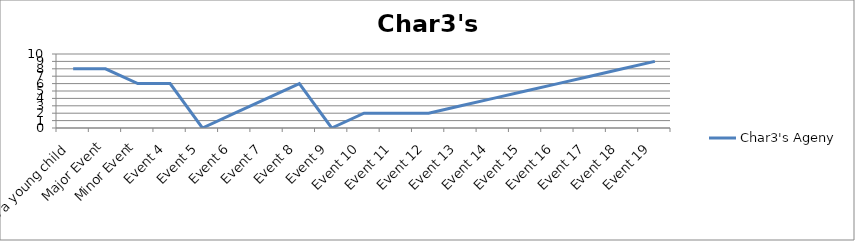
| Category | Char3's Ageny |
|---|---|
| As a young child | 8 |
| Major Event | 8 |
| Minor Event | 6 |
| Event 4 | 6 |
| Event 5 | 0 |
| Event 6 | 2 |
| Event 7 | 4 |
| Event 8 | 6 |
| Event 9 | 0 |
| Event 10 | 2 |
| Event 11 | 2 |
| Event 12 | 2 |
| Event 13 | 3 |
| Event 14 | 4 |
| Event 15 | 5 |
| Event 16 | 6 |
| Event 17 | 7 |
| Event 18 | 8 |
| Event 19 | 9 |